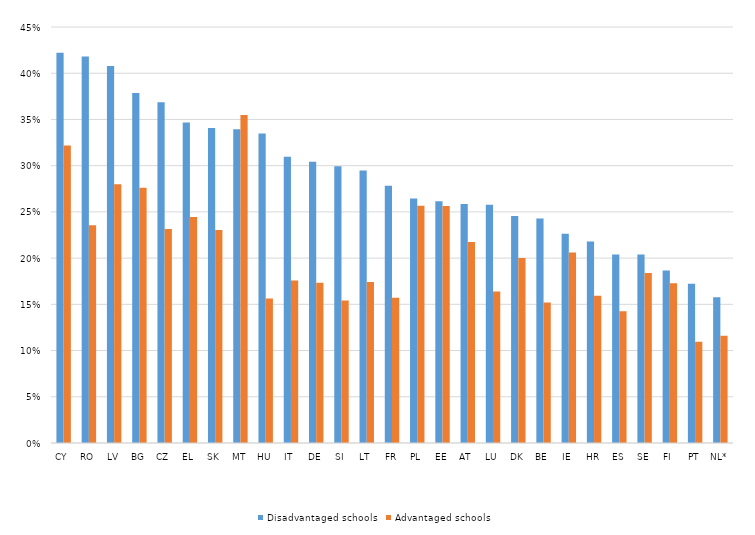
| Category | Disadvantaged schools | Advantaged schools |
|---|---|---|
| CY | 0.422 | 0.322 |
| RO | 0.418 | 0.236 |
| LV | 0.408 | 0.28 |
| BG | 0.379 | 0.276 |
| CZ | 0.369 | 0.232 |
| EL | 0.347 | 0.245 |
| SK | 0.341 | 0.23 |
| MT | 0.339 | 0.355 |
| HU | 0.335 | 0.156 |
| IT | 0.31 | 0.176 |
| DE | 0.304 | 0.173 |
| SI | 0.299 | 0.154 |
| LT | 0.295 | 0.174 |
| FR | 0.278 | 0.157 |
| PL | 0.264 | 0.257 |
| EE | 0.261 | 0.256 |
| AT | 0.259 | 0.217 |
| LU | 0.258 | 0.164 |
| DK | 0.246 | 0.2 |
| BE | 0.243 | 0.152 |
| IE | 0.226 | 0.206 |
| HR | 0.218 | 0.159 |
| ES | 0.204 | 0.143 |
| SE | 0.204 | 0.184 |
| FI | 0.187 | 0.173 |
| PT | 0.172 | 0.11 |
| NL* | 0.158 | 0.116 |